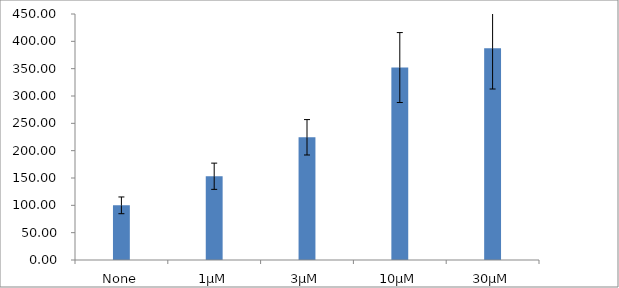
| Category | Series 0 |
|---|---|
| None | 100 |
| 1µM | 153.21 |
| 3µM | 224.471 |
| 10µM | 352.049 |
| 30µM | 387.426 |